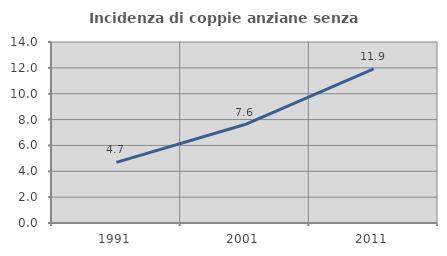
| Category | Incidenza di coppie anziane senza figli  |
|---|---|
| 1991.0 | 4.687 |
| 2001.0 | 7.616 |
| 2011.0 | 11.924 |